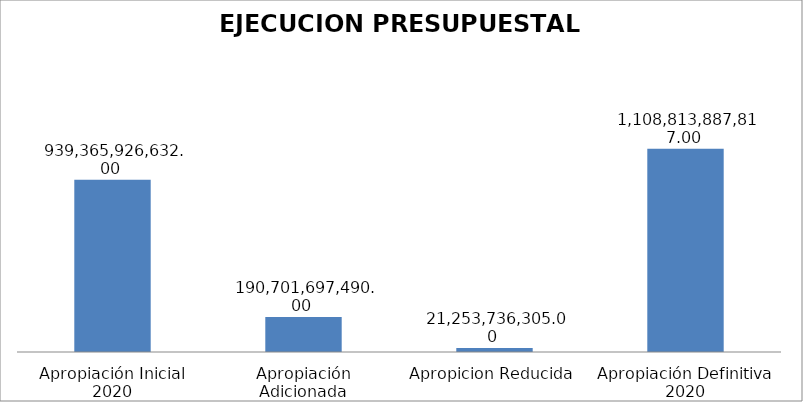
| Category | Series 0 |
|---|---|
| Apropiación Inicial 2020 | 939365926632 |
| Apropiación Adicionada | 190701697490 |
| Apropicion Reducida | 21253736305 |
| Apropiación Definitiva 2020 | 1108813887817 |